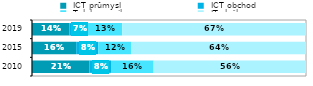
| Category |  ICT průmysl |  ICT obchod |  Telekomunikace |  IT služby  |
|---|---|---|---|---|
| 2010.0 | 0.209 | 0.079 | 0.156 | 0.556 |
| 2015.0 | 0.161 | 0.08 | 0.12 | 0.638 |
| 2019.0 | 0.137 | 0.065 | 0.127 | 0.671 |